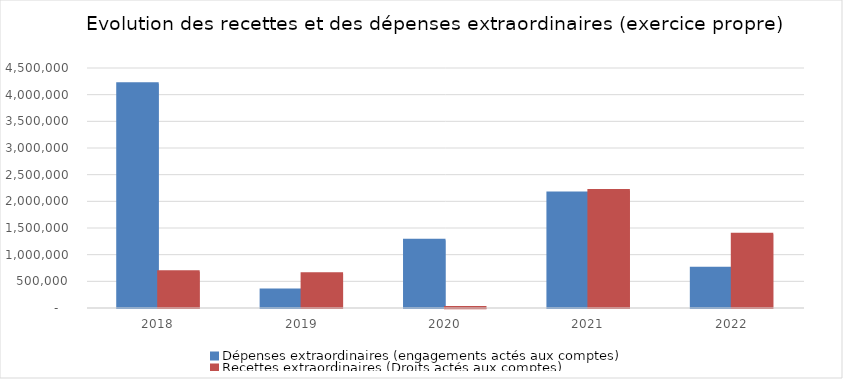
| Category | Dépenses extraordinaires (engagements actés aux comptes) | Recettes extraordinaires (Droits actés aux comptes) |
|---|---|---|
| 2018.0 | 4204455.41 | 679131.51 |
| 2019.0 | 335646.25 | 640965.33 |
| 2020.0 | 1269070.2 | 5660.02 |
| 2021.0 | 2157046.6 | 2203257.34 |
| 2022.0 | 746831.83 | 1384897.37 |